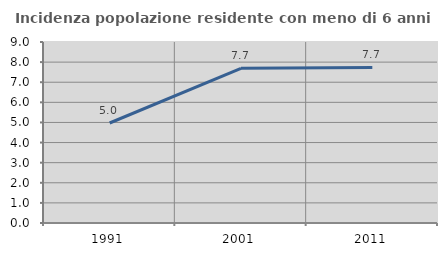
| Category | Incidenza popolazione residente con meno di 6 anni |
|---|---|
| 1991.0 | 4.972 |
| 2001.0 | 7.692 |
| 2011.0 | 7.733 |